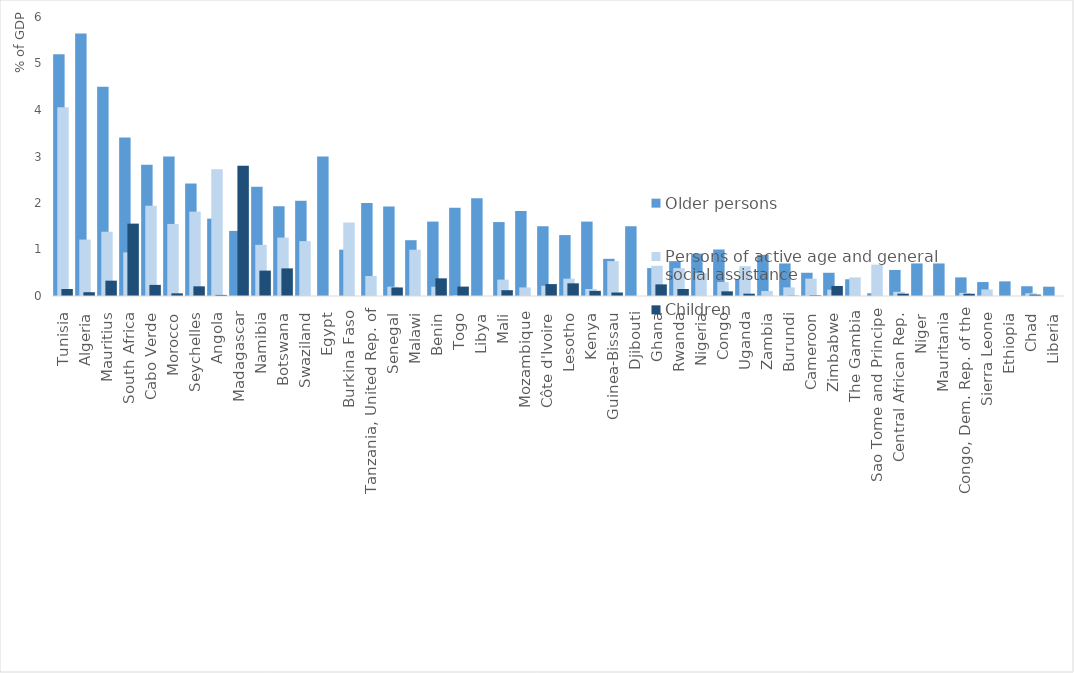
| Category | Older persons | Persons of active age and general social assistance | Children |
|---|---|---|---|
| Tunisia | 5.2 | 4.058 | 0.15 |
| Algeria | 5.647 | 1.214 | 0.081 |
| Mauritius | 4.5 | 1.382 | 0.33 |
| South Africa | 3.41 | 0.937 | 1.557 |
| Cabo Verde | 2.82 | 1.941 | 0.239 |
| Morocco | 3 | 1.55 | 0.058 |
| Seychelles | 2.42 | 1.814 | 0.208 |
| Angola | 1.664 | 2.728 | 0.023 |
| Madagascar | 1.4 | 0 | 2.799 |
| Namibia | 2.35 | 1.1 | 0.546 |
| Botswana | 1.93 | 1.256 | 0.594 |
| Swaziland | 2.05 | 1.18 | 0 |
| Egypt | 3 | 0 | 0 |
| Burkina Faso | 0.996 | 1.58 | 0.001 |
| Tanzania, United Rep. of | 2 | 0.431 | 0 |
| Senegal | 1.927 | 0.2 | 0.183 |
| Malawi | 1.2 | 0.995 | 0 |
| Benin | 1.6 | 0.2 | 0.38 |
| Togo | 1.9 | 0.013 | 0.202 |
| Libya | 2.1 | 0 | 0 |
| Mali | 1.59 | 0.352 | 0.125 |
| Mozambique | 1.83 | 0.184 | 0 |
| Côte d'Ivoire | 1.5 | 0.219 | 0.256 |
| Lesotho | 1.31 | 0.372 | 0.272 |
| Kenya | 1.6 | 0.15 | 0.111 |
| Guinea-Bissau | 0.8 | 0.75 | 0.075 |
| Djibouti | 1.5 | 0 | 0 |
| Ghana | 0.6 | 0.65 | 0.25 |
| Rwanda | 0.75 | 0.6 | 0.15 |
| Nigeria | 0.91 | 0.49 | 0 |
| Congo | 1 | 0.3 | 0.1 |
| Uganda | 0.364 | 0.641 | 0.05 |
| Zambia | 0.885 | 0.107 | 0 |
| Burundi | 0.7 | 0.186 | 0.006 |
| Cameroon | 0.5 | 0.374 | 0.015 |
| Zimbabwe | 0.5 | 0.135 | 0.215 |
| The Gambia | 0.36 | 0.4 | 0 |
| Sao Tome and Principe | 0.059 | 0.674 | 0 |
| Central African Rep. | 0.56 | 0.09 | 0.05 |
| Niger | 0.7 | 0 | 0 |
| Mauritania | 0.7 | 0 | 0 |
| Congo, Dem. Rep. of the | 0.4 | 0.068 | 0.048 |
| Sierra Leone | 0.3 | 0.141 | 0 |
| Ethiopia | 0.315 | 0 | 0 |
| Chad | 0.21 | 0.06 | 0.03 |
| Liberia | 0.2 | 0 | 0 |